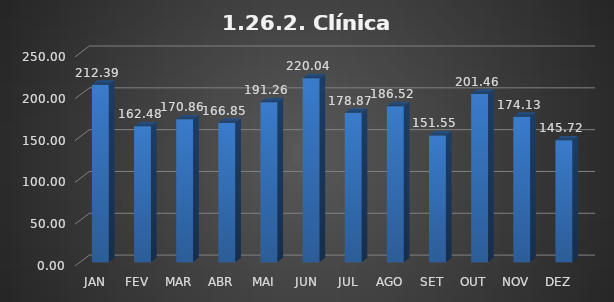
| Category | 1.26.2. Clínica Pediátrica |
|---|---|
|  JAN  | 212.386 |
|  FEV  | 162.477 |
|  MAR  | 170.856 |
|  ABR  | 166.849 |
|  MAI  | 191.257 |
|  JUN  | 220.036 |
|  JUL  | 178.871 |
|  AGO  | 186.521 |
|  SET  | 151.548 |
|  OUT  | 201.457 |
|  NOV  | 174.135 |
|  DEZ  | 145.719 |